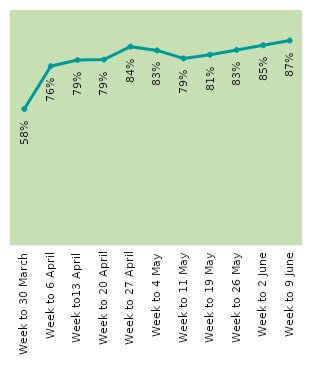
| Category | Series 0 |
|---|---|
| Week to 30 March | 0.579 |
| Week to 6 April | 0.761 |
| Week to13 April | 0.787 |
| Week to 20 April | 0.789 |
| Week to 27 April | 0.844 |
| Week to 4 May | 0.828 |
| Week to 11 May | 0.794 |
| Week to 19 May | 0.81 |
| Week to 26 May | 0.83 |
| Week to 2 June | 0.85 |
| Week to 9 June | 0.87 |